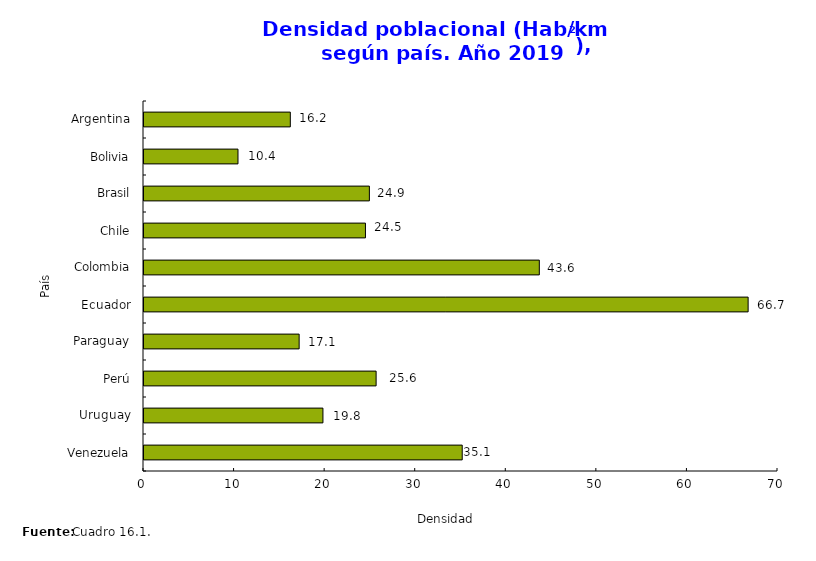
| Category | Densidad Poblacional (Hab/km²) |
|---|---|
| Venezuela | 35.135 |
| Uruguay | 19.758 |
| Perú | 25.628 |
| Paraguay | 17.13 |
| Ecuador | 66.703 |
| Colombia | 43.648 |
| Chile | 24.451 |
| Brasil | 24.885 |
| Bolivia | 10.377 |
| Argentina | 16.155 |